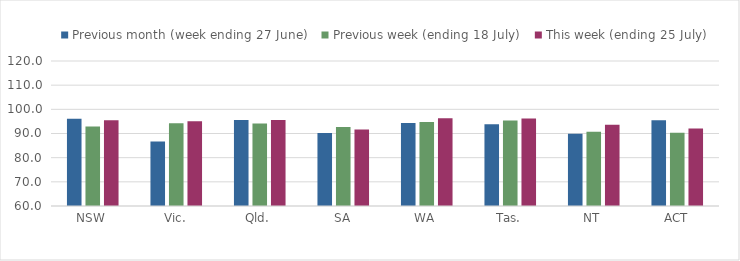
| Category | Previous month (week ending 27 June) | Previous week (ending 18 July) | This week (ending 25 July) |
|---|---|---|---|
| NSW | 96.119 | 92.897 | 95.433 |
| Vic. | 86.723 | 94.269 | 95.048 |
| Qld. | 95.562 | 94.133 | 95.547 |
| SA | 90.244 | 92.662 | 91.613 |
| WA | 94.371 | 94.785 | 96.313 |
| Tas. | 93.82 | 95.372 | 96.25 |
| NT | 89.91 | 90.717 | 93.577 |
| ACT | 95.509 | 90.278 | 92.036 |